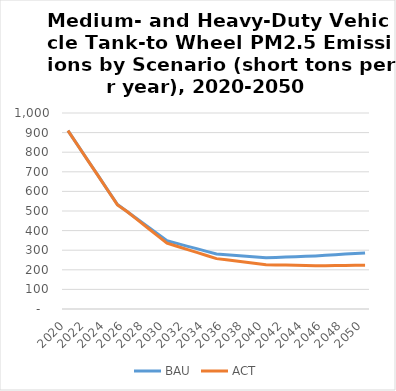
| Category | BAU | ACT |
|---|---|---|
| 2020.0 | 910 | 910 |
| 2021.0 | 835 | 834 |
| 2022.0 | 759 | 758 |
| 2023.0 | 684 | 683 |
| 2024.0 | 608 | 607 |
| 2025.0 | 533 | 531 |
| 2026.0 | 496 | 496 |
| 2027.0 | 459 | 456 |
| 2028.0 | 422 | 416 |
| 2029.0 | 385 | 376 |
| 2030.0 | 348 | 336 |
| 2031.0 | 335 | 320 |
| 2032.0 | 321 | 304 |
| 2033.0 | 308 | 289 |
| 2034.0 | 294 | 273 |
| 2035.0 | 281 | 257 |
| 2036.0 | 277 | 251 |
| 2037.0 | 273 | 245 |
| 2038.0 | 269 | 238 |
| 2039.0 | 265 | 232 |
| 2040.0 | 261 | 226 |
| 2041.0 | 263 | 225 |
| 2042.0 | 265 | 224 |
| 2043.0 | 267 | 223 |
| 2044.0 | 269 | 222 |
| 2045.0 | 271 | 221 |
| 2046.0 | 274 | 221 |
| 2047.0 | 277 | 222 |
| 2048.0 | 280 | 222 |
| 2049.0 | 283 | 223 |
| 2050.0 | 286 | 223 |